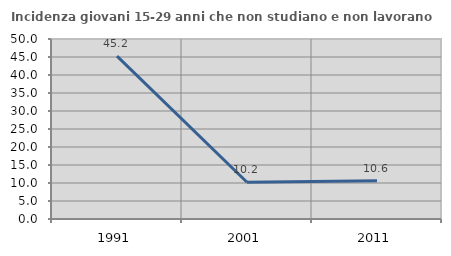
| Category | Incidenza giovani 15-29 anni che non studiano e non lavorano  |
|---|---|
| 1991.0 | 45.235 |
| 2001.0 | 10.219 |
| 2011.0 | 10.638 |